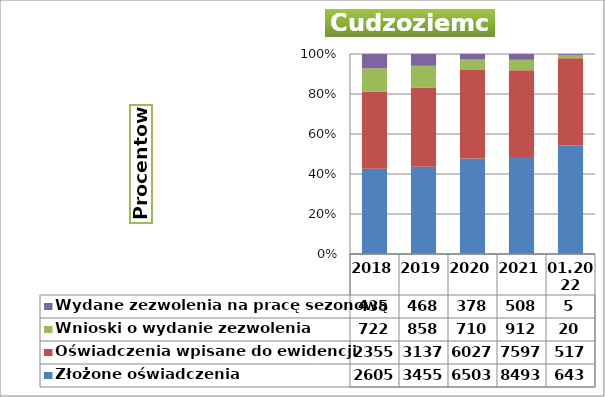
| Category | Złożone oświadczenia | Oświadczenia wpisane do ewidencji | Wnioski o wydanie zezwolenia | Wydane zezwolenia na pracę sezonową |
|---|---|---|---|---|
| 2018 | 2605 | 2355 | 722 | 435 |
| 2019 | 3455 | 3137 | 858 | 468 |
| 2020 | 6503 | 6027 | 710 | 378 |
| 2021 | 8493 | 7597 | 912 | 508 |
| 01.2022 | 643 | 517 | 20 | 5 |